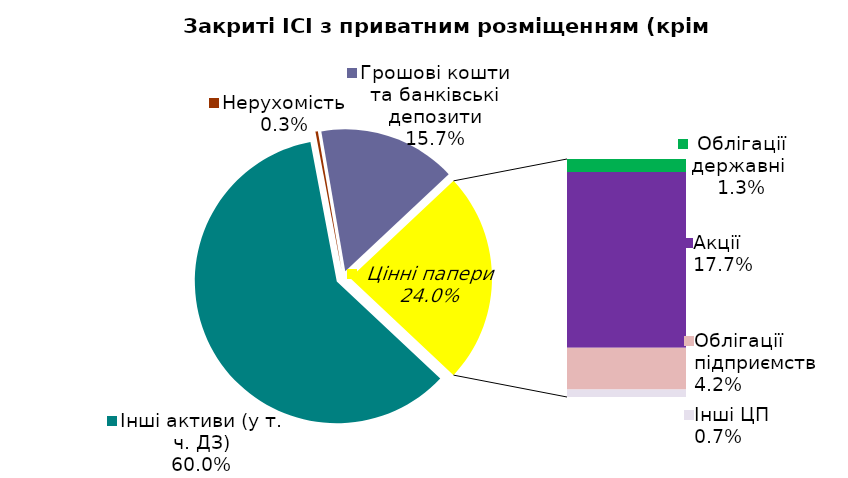
| Category | Series 0 |
|---|---|
| Інші активи (у т. ч. ДЗ) | 0.6 |
| Нерухомість | 0.003 |
| Грошові кошти та банківські депозити | 0.157 |
| Облігації державні  | 0.013 |
| Акцiї | 0.177 |
| Облігації підприємств | 0.042 |
| Інші ЦП | 0.007 |